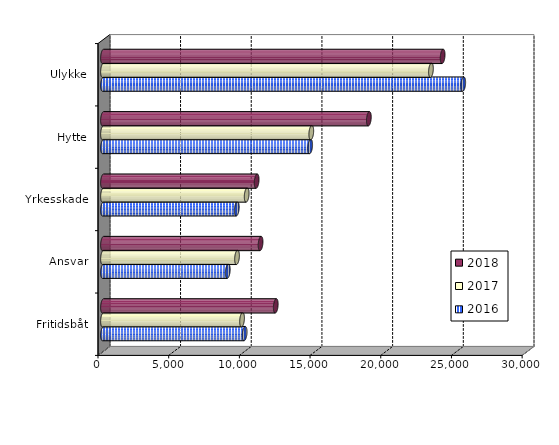
| Category | 2016 | 2017 | 2018 |
|---|---|---|---|
| Fritidsbåt | 10018.849 | 9835.302 | 12219.195 |
| Ansvar | 8825.393 | 9480.052 | 11145.096 |
| Yrkesskade | 9463 | 10163.027 | 10868.336 |
| Hytte | 14653.807 | 14731.573 | 18804.168 |
| Ulykke | 25480.007 | 23196.56 | 24022.283 |